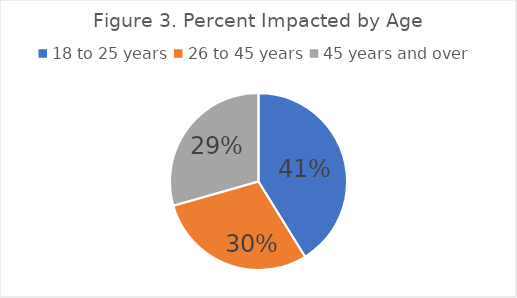
| Category | Iimpact by age |
|---|---|
| 18 to 25 years | 7 |
| 26 to 45 years | 5 |
| 45 years and over | 5 |